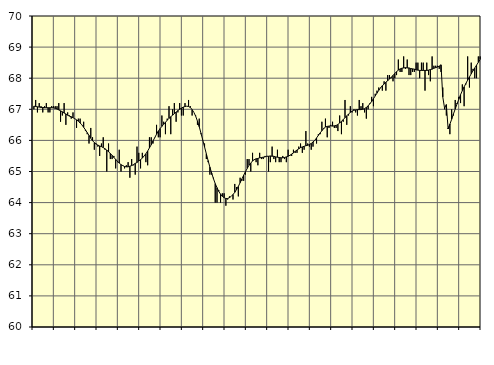
| Category | Piggar | Series 1 |
|---|---|---|
| nan | 67 | 67.1 |
| 1.0 | 67.3 | 67.09 |
| 1.0 | 66.9 | 67.08 |
| 1.0 | 67.2 | 67.07 |
| 1.0 | 67.1 | 67.06 |
| 1.0 | 66.9 | 67.06 |
| 1.0 | 67.1 | 67.05 |
| 1.0 | 67.2 | 67.05 |
| 1.0 | 66.9 | 67.05 |
| 1.0 | 66.9 | 67.05 |
| 1.0 | 67.1 | 67.05 |
| 1.0 | 67.1 | 67.05 |
| nan | 67.1 | 67.03 |
| 2.0 | 67.1 | 67.01 |
| 2.0 | 67.2 | 66.98 |
| 2.0 | 66.6 | 66.95 |
| 2.0 | 66.8 | 66.92 |
| 2.0 | 67.2 | 66.88 |
| 2.0 | 66.5 | 66.85 |
| 2.0 | 66.9 | 66.81 |
| 2.0 | 66.8 | 66.78 |
| 2.0 | 66.7 | 66.76 |
| 2.0 | 66.9 | 66.73 |
| 2.0 | 66.7 | 66.7 |
| nan | 66.4 | 66.66 |
| 3.0 | 66.7 | 66.62 |
| 3.0 | 66.7 | 66.56 |
| 3.0 | 66.5 | 66.5 |
| 3.0 | 66.6 | 66.42 |
| 3.0 | 66.3 | 66.34 |
| 3.0 | 66.2 | 66.25 |
| 3.0 | 65.9 | 66.16 |
| 3.0 | 66.4 | 66.07 |
| 3.0 | 66.1 | 65.99 |
| 3.0 | 65.7 | 65.93 |
| 3.0 | 65.9 | 65.88 |
| nan | 65.8 | 65.85 |
| 4.0 | 65.5 | 65.82 |
| 4.0 | 65.9 | 65.8 |
| 4.0 | 66.1 | 65.77 |
| 4.0 | 65.7 | 65.73 |
| 4.0 | 65 | 65.69 |
| 4.0 | 65.9 | 65.63 |
| 4.0 | 65.4 | 65.58 |
| 4.0 | 65.4 | 65.52 |
| 4.0 | 65.5 | 65.45 |
| 4.0 | 65.1 | 65.39 |
| 4.0 | 65.3 | 65.33 |
| nan | 65.7 | 65.27 |
| 5.0 | 65 | 65.22 |
| 5.0 | 65.2 | 65.19 |
| 5.0 | 65.1 | 65.16 |
| 5.0 | 65.2 | 65.15 |
| 5.0 | 65.3 | 65.15 |
| 5.0 | 64.8 | 65.17 |
| 5.0 | 65.4 | 65.19 |
| 5.0 | 65.2 | 65.22 |
| 5.0 | 64.9 | 65.26 |
| 5.0 | 65.8 | 65.29 |
| 5.0 | 65.6 | 65.34 |
| nan | 65.1 | 65.38 |
| 6.0 | 65.6 | 65.43 |
| 6.0 | 65.5 | 65.5 |
| 6.0 | 65.3 | 65.57 |
| 6.0 | 65.2 | 65.66 |
| 6.0 | 66.1 | 65.76 |
| 6.0 | 66.1 | 65.86 |
| 6.0 | 65.9 | 65.98 |
| 6.0 | 66.1 | 66.09 |
| 6.0 | 66.5 | 66.2 |
| 6.0 | 66.1 | 66.3 |
| 6.0 | 66.1 | 66.38 |
| nan | 66.8 | 66.45 |
| 7.0 | 66.6 | 66.52 |
| 7.0 | 66.2 | 66.58 |
| 7.0 | 66.7 | 66.65 |
| 7.0 | 67.1 | 66.71 |
| 7.0 | 66.2 | 66.76 |
| 7.0 | 67 | 66.81 |
| 7.0 | 67.2 | 66.86 |
| 7.0 | 66.6 | 66.91 |
| 7.0 | 66.9 | 66.96 |
| 7.0 | 67.2 | 67 |
| 7.0 | 66.8 | 67.04 |
| nan | 66.8 | 67.07 |
| 8.0 | 67.2 | 67.09 |
| 8.0 | 67.1 | 67.1 |
| 8.0 | 67.3 | 67.09 |
| 8.0 | 67.1 | 67.06 |
| 8.0 | 66.8 | 66.99 |
| 8.0 | 66.9 | 66.9 |
| 8.0 | 66.8 | 66.78 |
| 8.0 | 66.5 | 66.62 |
| 8.0 | 66.7 | 66.44 |
| 8.0 | 66.2 | 66.23 |
| 8.0 | 66 | 66.01 |
| nan | 65.9 | 65.79 |
| 9.0 | 65.4 | 65.57 |
| 9.0 | 65.3 | 65.35 |
| 9.0 | 64.9 | 65.14 |
| 9.0 | 64.9 | 64.95 |
| 9.0 | 64.8 | 64.77 |
| 9.0 | 64 | 64.61 |
| 9.0 | 64 | 64.48 |
| 9.0 | 64.4 | 64.36 |
| 9.0 | 64 | 64.27 |
| 9.0 | 64.3 | 64.2 |
| 9.0 | 64.3 | 64.16 |
| nan | 63.9 | 64.13 |
| 10.0 | 64.1 | 64.13 |
| 10.0 | 64.2 | 64.16 |
| 10.0 | 64.2 | 64.2 |
| 10.0 | 64.1 | 64.26 |
| 10.0 | 64.6 | 64.33 |
| 10.0 | 64.5 | 64.42 |
| 10.0 | 64.2 | 64.52 |
| 10.0 | 64.8 | 64.64 |
| 10.0 | 64.7 | 64.76 |
| 10.0 | 64.7 | 64.88 |
| 10.0 | 64.9 | 64.99 |
| nan | 65.4 | 65.1 |
| 11.0 | 65.4 | 65.2 |
| 11.0 | 65 | 65.27 |
| 11.0 | 65.6 | 65.34 |
| 11.0 | 65.4 | 65.38 |
| 11.0 | 65.3 | 65.41 |
| 11.0 | 65.2 | 65.42 |
| 11.0 | 65.6 | 65.44 |
| 11.0 | 65.4 | 65.45 |
| 11.0 | 65.4 | 65.46 |
| 11.0 | 65.5 | 65.47 |
| 11.0 | 65.5 | 65.49 |
| nan | 65 | 65.49 |
| 12.0 | 65.3 | 65.5 |
| 12.0 | 65.8 | 65.49 |
| 12.0 | 65.4 | 65.49 |
| 12.0 | 65.3 | 65.47 |
| 12.0 | 65.7 | 65.46 |
| 12.0 | 65.3 | 65.45 |
| 12.0 | 65.3 | 65.44 |
| 12.0 | 65.5 | 65.44 |
| 12.0 | 65.4 | 65.45 |
| 12.0 | 65.3 | 65.47 |
| 12.0 | 65.7 | 65.49 |
| nan | 65.5 | 65.52 |
| 13.0 | 65.5 | 65.56 |
| 13.0 | 65.7 | 65.6 |
| 13.0 | 65.6 | 65.65 |
| 13.0 | 65.6 | 65.69 |
| 13.0 | 65.8 | 65.73 |
| 13.0 | 65.9 | 65.77 |
| 13.0 | 65.6 | 65.79 |
| 13.0 | 65.7 | 65.81 |
| 13.0 | 66.3 | 65.83 |
| 13.0 | 65.9 | 65.84 |
| 13.0 | 65.8 | 65.87 |
| nan | 65.7 | 65.9 |
| 14.0 | 65.8 | 65.95 |
| 14.0 | 66 | 66 |
| 14.0 | 65.9 | 66.08 |
| 14.0 | 66.2 | 66.16 |
| 14.0 | 66.2 | 66.24 |
| 14.0 | 66.6 | 66.31 |
| 14.0 | 66.4 | 66.38 |
| 14.0 | 66.7 | 66.43 |
| 14.0 | 66.1 | 66.45 |
| 14.0 | 66.4 | 66.46 |
| 14.0 | 66.5 | 66.47 |
| nan | 66.6 | 66.46 |
| 15.0 | 66.4 | 66.47 |
| 15.0 | 66.4 | 66.48 |
| 15.0 | 66.3 | 66.51 |
| 15.0 | 66.8 | 66.56 |
| 15.0 | 66.2 | 66.61 |
| 15.0 | 66.6 | 66.67 |
| 15.0 | 67.3 | 66.73 |
| 15.0 | 66.5 | 66.79 |
| 15.0 | 66.8 | 66.85 |
| 15.0 | 67.1 | 66.9 |
| 15.0 | 66.9 | 66.94 |
| nan | 67 | 66.97 |
| 16.0 | 66.9 | 66.98 |
| 16.0 | 66.8 | 66.99 |
| 16.0 | 67.3 | 66.99 |
| 16.0 | 67.1 | 66.99 |
| 16.0 | 67.2 | 67 |
| 16.0 | 66.9 | 67.02 |
| 16.0 | 66.7 | 67.06 |
| 16.0 | 67 | 67.11 |
| 16.0 | 67.2 | 67.18 |
| 16.0 | 67.4 | 67.25 |
| 16.0 | 67.1 | 67.34 |
| nan | 67.5 | 67.43 |
| 17.0 | 67.6 | 67.52 |
| 17.0 | 67.7 | 67.61 |
| 17.0 | 67.7 | 67.69 |
| 17.0 | 67.6 | 67.76 |
| 17.0 | 67.9 | 67.81 |
| 17.0 | 67.6 | 67.87 |
| 17.0 | 68.1 | 67.92 |
| 17.0 | 68.1 | 67.97 |
| 17.0 | 68 | 68.03 |
| 17.0 | 67.9 | 68.09 |
| 17.0 | 68 | 68.15 |
| nan | 68.1 | 68.21 |
| 18.0 | 68.6 | 68.26 |
| 18.0 | 68.2 | 68.3 |
| 18.0 | 68.2 | 68.32 |
| 18.0 | 68.7 | 68.33 |
| 18.0 | 68.3 | 68.34 |
| 18.0 | 68.6 | 68.33 |
| 18.0 | 68.1 | 68.33 |
| 18.0 | 68.1 | 68.31 |
| 18.0 | 68.2 | 68.3 |
| 18.0 | 68.2 | 68.29 |
| 18.0 | 68.5 | 68.27 |
| nan | 68.5 | 68.26 |
| 19.0 | 68 | 68.25 |
| 19.0 | 68.5 | 68.25 |
| 19.0 | 68.5 | 68.25 |
| 19.0 | 67.6 | 68.25 |
| 19.0 | 68.5 | 68.25 |
| 19.0 | 68.1 | 68.26 |
| 19.0 | 67.9 | 68.28 |
| 19.0 | 68.7 | 68.29 |
| 19.0 | 68.4 | 68.32 |
| 19.0 | 68.4 | 68.34 |
| 19.0 | 68.4 | 68.36 |
| nan | 68.3 | 68.39 |
| 20.0 | 68.2 | 68.43 |
| 20.0 | 67.7 | 67.4 |
| 20.0 | 67 | 67.04 |
| 20.0 | 66.8 | 67.15 |
| 20.0 | 66.4 | 66.37 |
| 20.0 | 66.2 | 66.52 |
| 20.0 | 67 | 66.68 |
| 20.0 | 66.8 | 66.85 |
| 20.0 | 67.3 | 67.01 |
| 20.0 | 67.2 | 67.17 |
| 20.0 | 67.4 | 67.32 |
| nan | 67.2 | 67.47 |
| 21.0 | 67.8 | 67.6 |
| 21.0 | 67.1 | 67.72 |
| 21.0 | 67.8 | 67.83 |
| 21.0 | 68.7 | 67.94 |
| 21.0 | 67.7 | 68.04 |
| 21.0 | 68.5 | 68.14 |
| 21.0 | 68.3 | 68.24 |
| 21.0 | 68 | 68.33 |
| 21.0 | 68 | 68.42 |
| 21.0 | 68.7 | 68.51 |
| 21.0 | 68.7 | 68.6 |